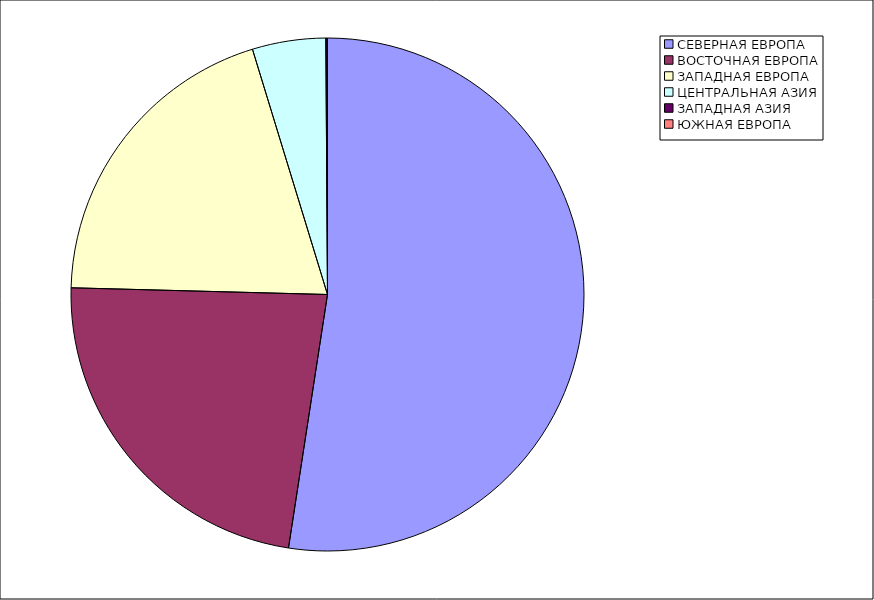
| Category | Оборот |
|---|---|
| СЕВЕРНАЯ ЕВРОПА | 52.431 |
| ВОСТОЧНАЯ ЕВРОПА | 22.985 |
| ЗАПАДНАЯ ЕВРОПА | 19.858 |
| ЦЕНТРАЛЬНАЯ АЗИЯ | 4.622 |
| ЗАПАДНАЯ АЗИЯ | 0.087 |
| ЮЖНАЯ ЕВРОПА | 0.017 |